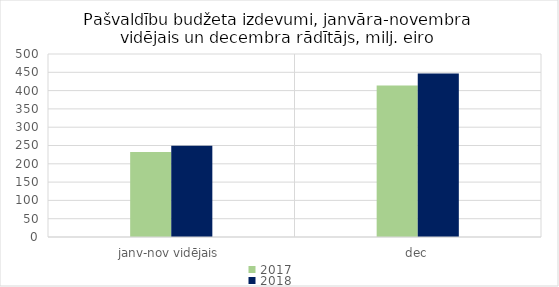
| Category | 2017 | 2018 |
|---|---|---|
| janv-nov vidējais | 232075 | 249339.219 |
| dec | 414250.751 | 446706.592 |